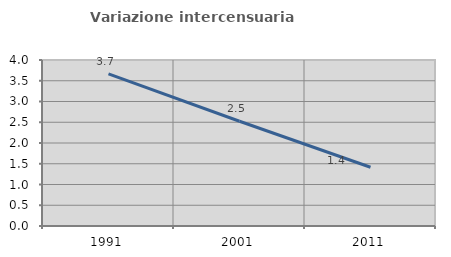
| Category | Variazione intercensuaria annua |
|---|---|
| 1991.0 | 3.667 |
| 2001.0 | 2.525 |
| 2011.0 | 1.415 |